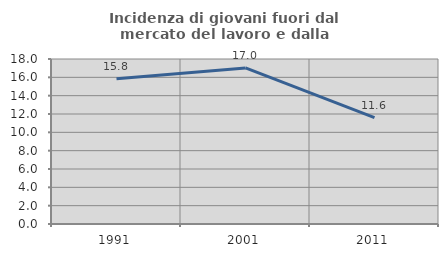
| Category | Incidenza di giovani fuori dal mercato del lavoro e dalla formazione  |
|---|---|
| 1991.0 | 15.844 |
| 2001.0 | 17.029 |
| 2011.0 | 11.602 |